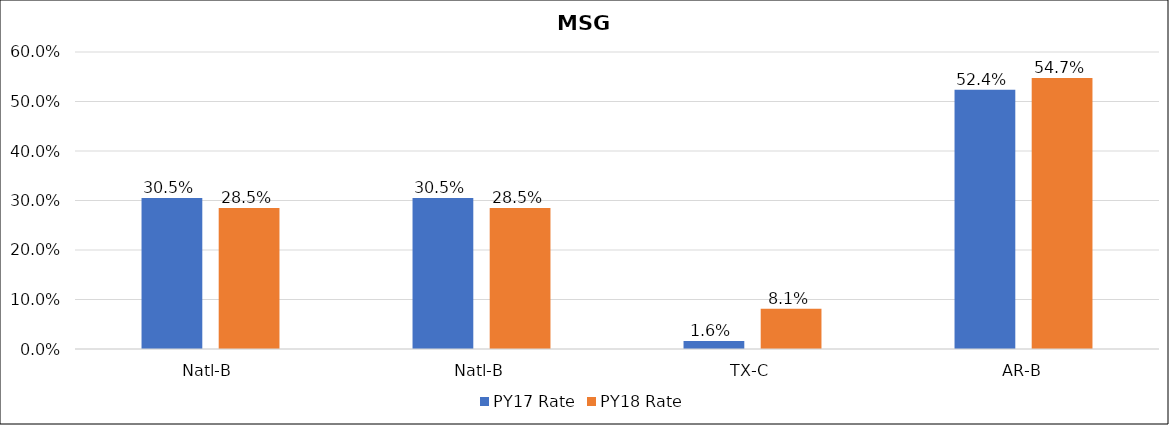
| Category | PY17 Rate | PY18 Rate |
|---|---|---|
| Natl-B | 0.305 | 0.285 |
| Natl-B | 0.305 | 0.285 |
| TX-C | 0.016 | 0.081 |
| AR-B | 0.524 | 0.547 |